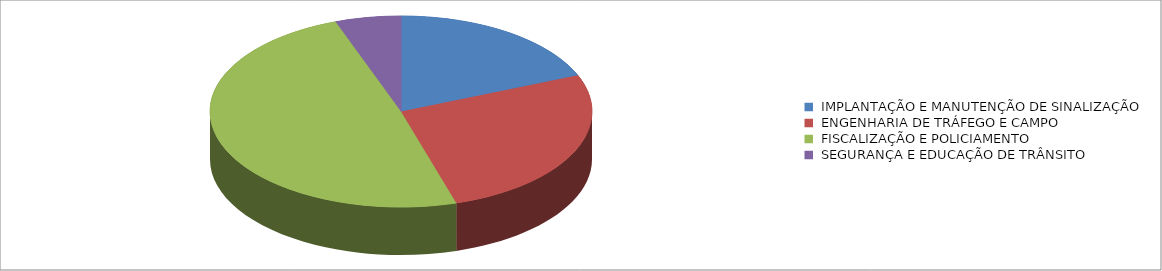
| Category | Series 0 | Series 1 |
|---|---|---|
| IMPLANTAÇÃO E MANUTENÇÃO DE SINALIZAÇÃO | 18205140.69 |  |
| ENGENHARIA DE TRÁFEGO E CAMPO | 25659749.7 |  |
| FISCALIZAÇÃO E POLICIAMENTO | 47519572.02 |  |
| SEGURANÇA E EDUCAÇÃO DE TRÂNSITO | 5378451.27 |  |